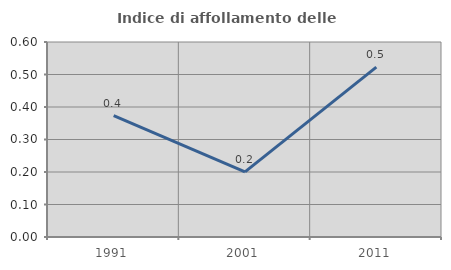
| Category | Indice di affollamento delle abitazioni  |
|---|---|
| 1991.0 | 0.374 |
| 2001.0 | 0.2 |
| 2011.0 | 0.523 |